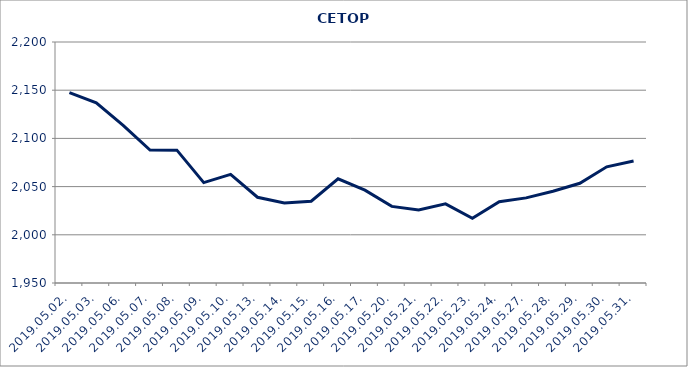
| Category | Series 3 |
|---|---|
| 2019.05.02. | 2147.386 |
| 2019.05.03. | 2136.927 |
| 2019.05.06. | 2113.432 |
| 2019.05.07. | 2087.889 |
| 2019.05.08. | 2087.837 |
| 2019.05.09. | 2054.158 |
| 2019.05.10. | 2062.71 |
| 2019.05.13. | 2038.936 |
| 2019.05.14. | 2033.011 |
| 2019.05.15. | 2034.809 |
| 2019.05.16. | 2058.039 |
| 2019.05.17. | 2046.341 |
| 2019.05.20. | 2029.475 |
| 2019.05.21. | 2025.854 |
| 2019.05.22. | 2032.113 |
| 2019.05.23. | 2017.154 |
| 2019.05.24. | 2034.381 |
| 2019.05.27. | 2038.296 |
| 2019.05.28. | 2045.236 |
| 2019.05.29. | 2053.447 |
| 2019.05.30. | 2070.528 |
| 2019.05.31. | 2076.617 |